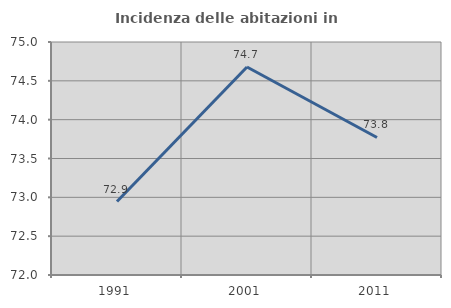
| Category | Incidenza delle abitazioni in proprietà  |
|---|---|
| 1991.0 | 72.946 |
| 2001.0 | 74.678 |
| 2011.0 | 73.77 |